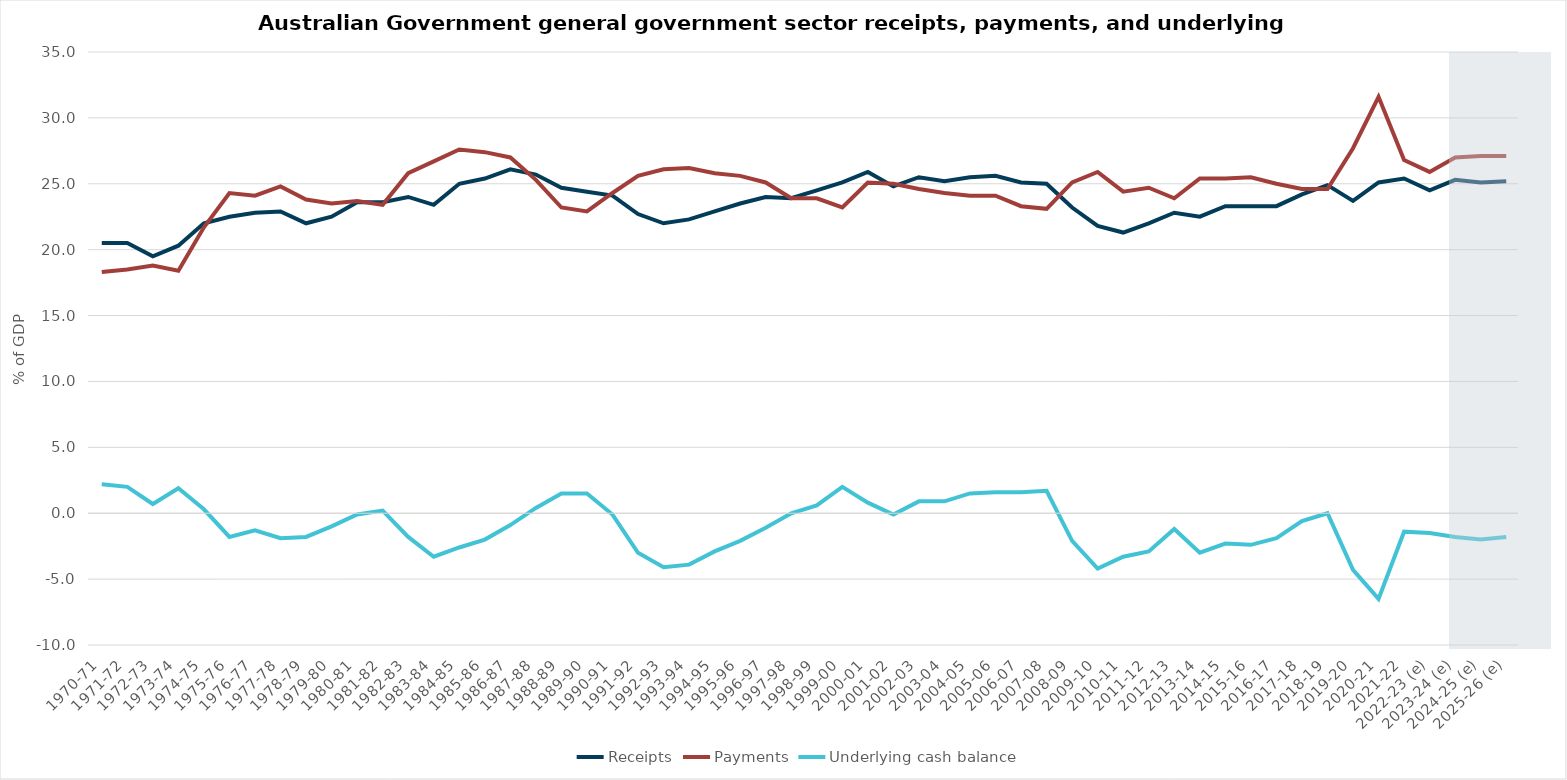
| Category | Receipts | Payments | Underlying cash balance |
|---|---|---|---|
| 1970-71 | 20.5 | 18.3 | 2.2 |
| 1971-72 | 20.5 | 18.5 | 2 |
| 1972-73 | 19.5 | 18.8 | 0.7 |
| 1973-74 | 20.3 | 18.4 | 1.9 |
| 1974-75 | 22 | 21.7 | 0.3 |
| 1975-76 | 22.5 | 24.3 | -1.8 |
| 1976-77 | 22.8 | 24.1 | -1.3 |
| 1977-78 | 22.9 | 24.8 | -1.9 |
| 1978-79 | 22 | 23.8 | -1.8 |
| 1979-80 | 22.5 | 23.5 | -1 |
| 1980-81 | 23.6 | 23.7 | -0.1 |
| 1981-82 | 23.6 | 23.4 | 0.2 |
| 1982-83 | 24 | 25.8 | -1.8 |
| 1983-84 | 23.4 | 26.7 | -3.3 |
| 1984-85 | 25 | 27.6 | -2.6 |
| 1985-86 | 25.4 | 27.4 | -2 |
| 1986-87 | 26.1 | 27 | -0.9 |
| 1987-88 | 25.7 | 25.3 | 0.4 |
| 1988-89 | 24.7 | 23.2 | 1.5 |
| 1989-90 | 24.4 | 22.9 | 1.5 |
| 1990-91 | 24.1 | 24.3 | -0.1 |
| 1991-92 | 22.7 | 25.6 | -3 |
| 1992-93 | 22 | 26.1 | -4.1 |
| 1993-94 | 22.3 | 26.2 | -3.9 |
| 1994-95 | 22.9 | 25.8 | -2.9 |
| 1995-96 | 23.5 | 25.6 | -2.1 |
| 1996-97 | 24 | 25.1 | -1.1 |
| 1997-98 | 23.9 | 23.9 | 0 |
| 1998-99 | 24.5 | 23.9 | 0.6 |
| 1999-00 | 25.1 | 23.2 | 2 |
| 2000-01 | 25.9 | 25.1 | 0.8 |
| 2001-02 | 24.8 | 25 | -0.1 |
| 2002-03 | 25.5 | 24.6 | 0.9 |
| 2003-04 | 25.2 | 24.3 | 0.9 |
| 2004-05 | 25.5 | 24.1 | 1.5 |
| 2005-06 | 25.6 | 24.1 | 1.6 |
| 2006-07 | 25.1 | 23.3 | 1.6 |
| 2007-08 | 25 | 23.1 | 1.7 |
| 2008-09 | 23.2 | 25.1 | -2.1 |
| 2009-10 | 21.8 | 25.9 | -4.2 |
| 2010-11 | 21.3 | 24.4 | -3.3 |
| 2011-12 | 22 | 24.7 | -2.9 |
| 2012-13 | 22.8 | 23.9 | -1.2 |
| 2013-14 | 22.5 | 25.4 | -3 |
| 2014-15 | 23.3 | 25.4 | -2.3 |
| 2015-16 | 23.3 | 25.5 | -2.4 |
| 2016-17 | 23.3 | 25 | -1.9 |
| 2017-18 | 24.2 | 24.6 | -0.6 |
| 2018-19 | 24.9 | 24.6 | 0 |
| 2019-20 | 23.7 | 27.7 | -4.3 |
| 2020-21 | 25.1 | 31.6 | -6.5 |
| 2021-22 | 25.4 | 26.8 | -1.4 |
| 2022-23 (e) | 24.5 | 25.9 | -1.5 |
| 2023-24 (e) | 25.3 | 27 | -1.8 |
| 2024-25 (e) | 25.1 | 27.1 | -2 |
| 2025-26 (e) | 25.2 | 27.1 | -1.8 |